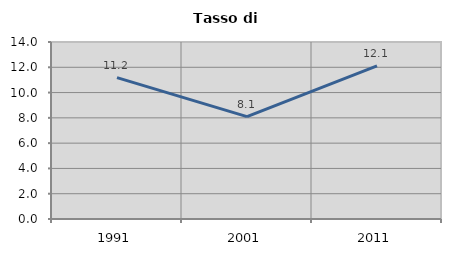
| Category | Tasso di disoccupazione   |
|---|---|
| 1991.0 | 11.18 |
| 2001.0 | 8.093 |
| 2011.0 | 12.104 |